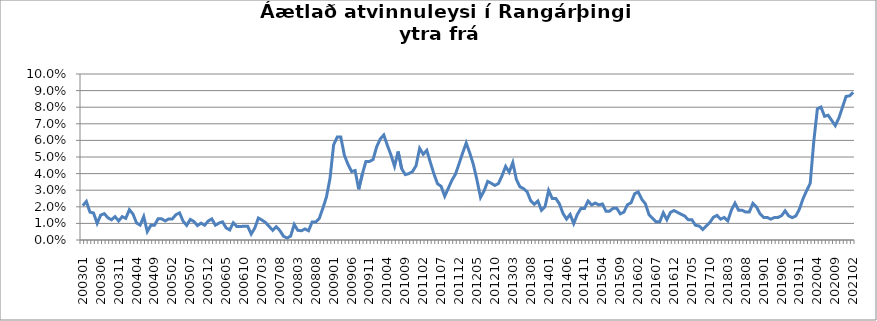
| Category | Series 0 |
|---|---|
| 200301 | 0.021 |
| 200302 | 0.023 |
| 200303 | 0.017 |
| 200304 | 0.016 |
| 200305 | 0.01 |
| 200306 | 0.015 |
| 200307 | 0.016 |
| 200308 | 0.013 |
| 200309 | 0.012 |
| 200310 | 0.014 |
| 200311 | 0.012 |
| 200312 | 0.014 |
| 200401 | 0.013 |
| 200402 | 0.018 |
| 200403 | 0.016 |
| 200404 | 0.01 |
| 200405 | 0.009 |
| 200406 | 0.014 |
| 200407 | 0.005 |
| 200408 | 0.009 |
| 200409 | 0.009 |
| 200410 | 0.013 |
| 200411 | 0.013 |
| 200412 | 0.011 |
| 200501 | 0.013 |
| 200502 | 0.013 |
| 200503 | 0.015 |
| 200504 | 0.016 |
| 200505 | 0.011 |
| 200506 | 0.009 |
| 200507 | 0.012 |
| 200508 | 0.011 |
| 200509 | 0.009 |
| 200510 | 0.01 |
| 200511 | 0.009 |
| 200512 | 0.011 |
| 200601 | 0.013 |
| 200602 | 0.009 |
| 200603 | 0.01 |
| 200604 | 0.011 |
| 200605 | 0.007 |
| 200606 | 0.006 |
| 200607 | 0.01 |
| 200608 | 0.008 |
| 200609 | 0.008 |
| 200610 | 0.008 |
| 200611 | 0.008 |
| 200612 | 0.004 |
| 200701 | 0.007 |
| 200702 | 0.013 |
| 200703 | 0.012 |
| 200704 | 0.011 |
| 200705 | 0.008 |
| 200706 | 0.006 |
| 200707 | 0.008 |
| 200708 | 0.006 |
| 200709 | 0.002 |
| 200710 | 0.001 |
| 200801 | 0.002 |
| 200802 | 0.009 |
| 200803 | 0.006 |
| 200804 | 0.006 |
| 200805 | 0.007 |
| 200806 | 0.006 |
| 200807 | 0.011 |
| 200808 | 0.011 |
| 200809 | 0.013 |
| 200810 | 0.019 |
| 200811 | 0.026 |
| 200812 | 0.037 |
| 200901 | 0.057 |
| 200902 | 0.062 |
| 200903 | 0.062 |
| 200904 | 0.051 |
| 200905 | 0.046 |
| 200906 | 0.041 |
| 200907 | 0.042 |
| 200908 | 0.031 |
| 200909 | 0.04 |
| 200910 | 0.047 |
| 200911 | 0.047 |
| 200912 | 0.048 |
| 201001 | 0.056 |
| 201002 | 0.061 |
| 201003 | 0.063 |
| 201004 | 0.057 |
| 201005 | 0.051 |
| 201006 | 0.044 |
| 201007 | 0.053 |
| 201008 | 0.043 |
| 201009 | 0.039 |
| 201010 | 0.04 |
| 201011 | 0.041 |
| 201012 | 0.045 |
| 201101 | 0.055 |
| 201102 | 0.052 |
| 201103 | 0.054 |
| 201104 | 0.047 |
| 201105 | 0.04 |
| 201106 | 0.034 |
| 201107 | 0.032 |
| 201108 | 0.026 |
| 201109 | 0.031 |
| 201110 | 0.036 |
| 201111 | 0.04 |
| 201112 | 0.046 |
| 201201 | 0.052 |
| 201202 | 0.058 |
| 201203 | 0.052 |
| 201204 | 0.045 |
| 201205 | 0.036 |
| 201206 | 0.026 |
| 201207 | 0.03 |
| 201208 | 0.035 |
| 201209 | 0.034 |
| 201210 | 0.033 |
| 201211 | 0.034 |
| 201212 | 0.039 |
| 201301 | 0.044 |
| 201302 | 0.041 |
| 201303 | 0.047 |
| 201304 | 0.036 |
| 201305 | 0.032 |
| 201306 | 0.031 |
| 201307 | 0.029 |
| 201308 | 0.024 |
| 201309 | 0.022 |
| 201310 | 0.023 |
| 201311 | 0.018 |
| 201312 | 0.02 |
| 201401 | 0.03 |
| 201402 | 0.025 |
| 201403 | 0.025 |
| 201404 | 0.022 |
| 201405 | 0.016 |
| 201406 | 0.013 |
| 201407 | 0.015 |
| 201408 | 0.01 |
| 201409 | 0.015 |
| 201410 | 0.019 |
| 201411 | 0.019 |
| 201412 | 0.023 |
| 201501 | 0.021 |
| 201502 | 0.022 |
| 201503 | 0.021 |
| 201504 | 0.022 |
| 201505 | 0.017 |
| 201506 | 0.017 |
| 201507 | 0.019 |
| 201508 | 0.019 |
| 201509 | 0.016 |
| 201510 | 0.017 |
| 201511 | 0.021 |
| 201512 | 0.022 |
| 201601 | 0.028 |
| 201602 | 0.029 |
| 201603 | 0.024 |
| 201604 | 0.022 |
| 201605 | 0.015 |
| 201606 | 0.013 |
| 201607 | 0.011 |
| 201608 | 0.011 |
| 201609 | 0.016 |
| 201610 | 0.012 |
| 201611 | 0.017 |
| 201612 | 0.018 |
| 201701 | 0.017 |
| 201702 | 0.015 |
| 201703 | 0.014 |
| 201704 | 0.012 |
| 201705 | 0.012 |
| 201706 | 0.009 |
| 201707 | 0.008 |
| 201708 | 0.006 |
| 201709 | 0.008 |
| 201710 | 0.011 |
| 201711 | 0.014 |
| 201712 | 0.015 |
| 201801 | 0.013 |
| 201802 | 0.014 |
| 201803 | 0.012 |
| 201804 | 0.018 |
| 201805 | 0.022 |
| 201806 | 0.018 |
| 201807 | 0.018 |
| 201808 | 0.017 |
| 201809 | 0.017 |
| 201810 | 0.022 |
| 201811 | 0.02 |
| 201812 | 0.016 |
| 201901 | 0.014 |
| 201902 | 0.014 |
| 201903 | 0.013 |
| 201904 | 0.014 |
| 201905 | 0.014 |
| 201906 | 0.015 |
| 201907 | 0.018 |
| 201908 | 0.014 |
| 201909 | 0.013 |
| 201910 | 0.015 |
| 201911 | 0.019 |
| 201912 | 0.025 |
| 202001 | 0.03 |
| 202002 | 0.034 |
| 202003 | 0.059 |
| 202004 | 0.079 |
| 202005 | 0.08 |
| 202006 | 0.075 |
| 202007 | 0.075 |
| 202008 | 0.072 |
| 202009 | 0.069 |
| 202010 | 0.074 |
| 202011 | 0.08 |
| 202012 | 0.086 |
| 202101 | 0.087 |
| 202102 | 0.089 |